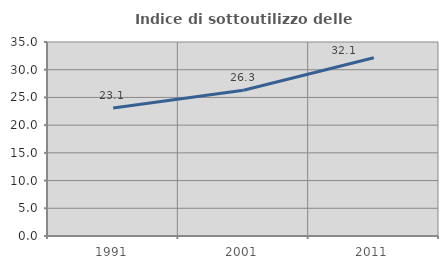
| Category | Indice di sottoutilizzo delle abitazioni  |
|---|---|
| 1991.0 | 23.112 |
| 2001.0 | 26.291 |
| 2011.0 | 32.15 |